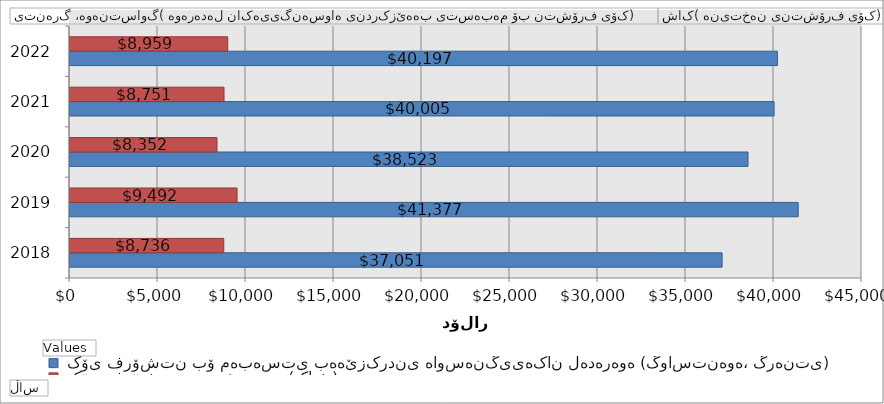
| Category |  کۆی فرۆشتن بۆ مەبەستی بەهێزکردنی هاوسەنگییەکان لەدەرەوە (گواستنەوە، گرەنتی) |  کۆی فرۆشتنی نەختینە (کاش) |
|---|---|---|
| 2018 | 37051.248 | 8735.91 |
| 2019 | 41376.743 | 9491.72 |
| 2020 | 38523.371 | 8351.73 |
| 2021 | 40004.53 | 8751.01 |
| 2022 | 40196.946 | 8959.3 |